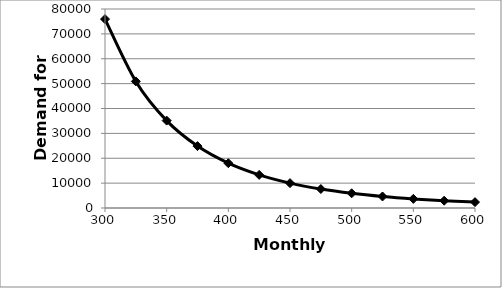
| Category | Series 0 |
|---|---|
| 300.0 | 75937.5 |
| 325.0 | 50891.56 |
| 350.0 | 35133.575 |
| 375.0 | 24883.2 |
| 400.0 | 18020.325 |
| 425.0 | 13308.157 |
| 450.0 | 10000 |
| 475.0 | 7631.23 |
| 500.0 | 5904.9 |
| 525.0 | 4626.644 |
| 550.0 | 3666.478 |
| 575.0 | 2935.779 |
| 600.0 | 2373.047 |